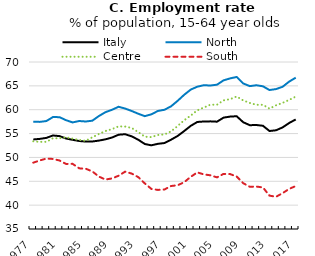
| Category | Italy | North | Centre | South |
|---|---|---|---|---|
| 1977.0 | 53.767 | 57.461 | 53.385 | 48.909 |
| 1978.0 | 53.886 | 57.45 | 53.264 | 49.366 |
| 1979.0 | 54.099 | 57.628 | 53.265 | 49.767 |
| 1980.0 | 54.601 | 58.465 | 54.036 | 49.681 |
| 1981.0 | 54.469 | 58.438 | 54.011 | 49.357 |
| 1982.0 | 53.96 | 57.798 | 54.222 | 48.627 |
| 1983.0 | 53.691 | 57.337 | 53.928 | 48.654 |
| 1984.0 | 53.443 | 57.633 | 53.66 | 47.714 |
| 1985.0 | 53.322 | 57.531 | 53.487 | 47.629 |
| 1986.0 | 53.34 | 57.701 | 54.228 | 47.07 |
| 1987.0 | 53.529 | 58.674 | 54.907 | 45.988 |
| 1988.0 | 53.791 | 59.483 | 55.533 | 45.362 |
| 1989.0 | 54.171 | 59.988 | 55.932 | 45.6 |
| 1990.0 | 54.758 | 60.617 | 56.515 | 46.162 |
| 1991.0 | 54.868 | 60.243 | 56.471 | 47.021 |
| 1992.0 | 54.417 | 59.734 | 56.177 | 46.615 |
| 1993.0 | 53.709 | 59.154 | 55.301 | 45.876 |
| 1994.0 | 52.81 | 58.648 | 54.351 | 44.549 |
| 1995.0 | 52.541 | 59.037 | 54.257 | 43.399 |
| 1996.0 | 52.856 | 59.741 | 54.707 | 43.191 |
| 1997.0 | 53.014 | 59.992 | 54.818 | 43.283 |
| 1998.0 | 53.714 | 60.712 | 55.46 | 44.011 |
| 1999.0 | 54.497 | 61.859 | 56.579 | 44.166 |
| 2000.0 | 55.529 | 63.127 | 57.792 | 44.805 |
| 2001.0 | 56.621 | 64.22 | 58.782 | 45.945 |
| 2002.0 | 57.429 | 64.825 | 59.873 | 46.862 |
| 2003.0 | 57.532 | 65.139 | 60.458 | 46.44 |
| 2004.0 | 57.559 | 65.071 | 61.058 | 46.255 |
| 2005.0 | 57.492 | 65.246 | 61.04 | 45.824 |
| 2006.0 | 58.338 | 66.15 | 61.962 | 46.55 |
| 2007.0 | 58.56 | 66.566 | 62.208 | 46.509 |
| 2008.0 | 58.633 | 66.861 | 62.776 | 46.002 |
| 2009.0 | 57.371 | 65.497 | 61.935 | 44.6 |
| 2010.0 | 56.758 | 64.945 | 61.418 | 43.841 |
| 2011.0 | 56.794 | 65.13 | 61.033 | 43.895 |
| 2012.0 | 56.636 | 64.909 | 61.035 | 43.708 |
| 2013.0 | 55.539 | 64.125 | 60.228 | 41.996 |
| 2014.0 | 55.692 | 64.324 | 60.918 | 41.753 |
| 2015.0 | 56.29 | 64.809 | 61.444 | 42.515 |
| 2016.0 | 57.218 | 65.889 | 62.045 | 43.408 |
| 2017.0 | 57.955 | 66.714 | 62.755 | 44 |